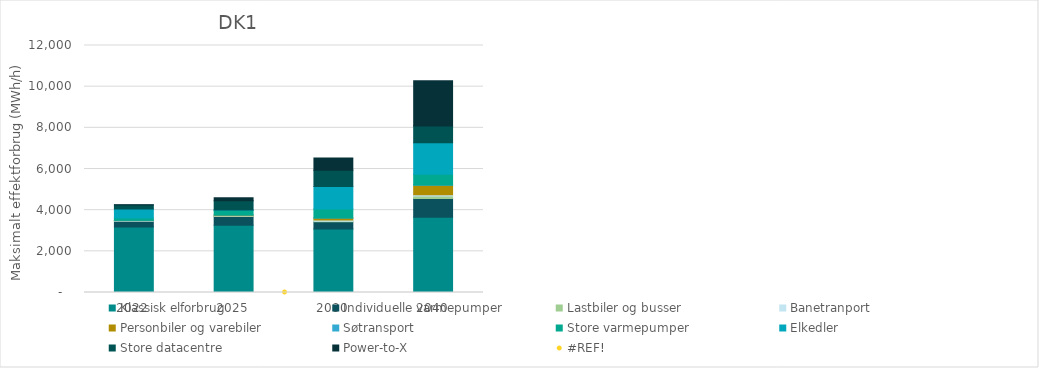
| Category | Klassisk elforbrug  | Individuelle varmepumper | Lastbiler og busser  | Banetranport | Personbiler og varebiler | Søtransport | Store varmepumper  | Elkedler | Store datacentre | Power-to-X |
|---|---|---|---|---|---|---|---|---|---|---|
| 2022.0 | 3177.552 | 291.457 | 2.11 | 24.33 | 16.386 | 0.789 | 112.34 | 436.567 | 189.744 | 12 |
| 2025.0 | 3265.926 | 425.182 | 7.833 | 31.779 | 36.66 | 1.383 | 226.98 | 15 | 443.87 | 149.185 |
| 2030.0 | 3086.261 | 346.99 | 33.445 | 53.931 | 95.519 | 2.253 | 432.256 | 1098.319 | 790.068 | 600 |
| 2040.0 | 3657.62 | 904.449 | 128.525 | 54.528 | 465.366 | 6.205 | 530.995 | 1521.925 | 822.746 | 2200 |